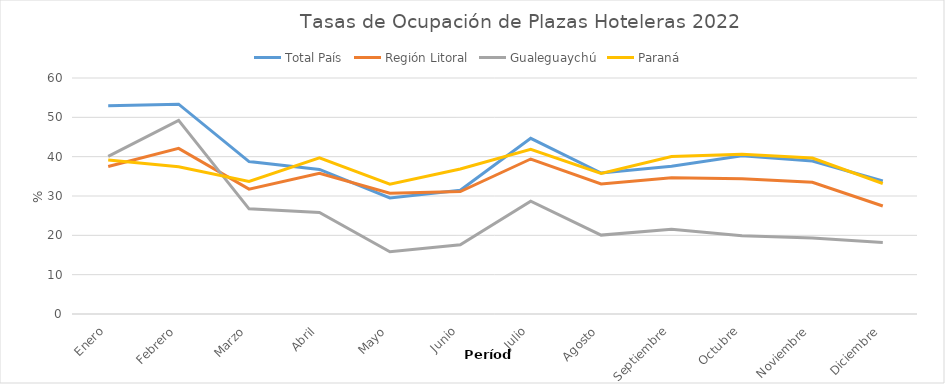
| Category | Total País | Región Litoral | Gualeguaychú | Paraná |
|---|---|---|---|---|
| Enero | 52.942 | 37.515 | 40.063 | 39.134 |
| Febrero | 53.354 | 42.106 | 49.246 | 37.415 |
| Marzo | 38.759 | 31.749 | 26.734 | 33.716 |
| Abril | 36.744 | 35.787 | 25.798 | 39.677 |
| Mayo | 29.516 | 30.714 | 15.826 | 33.026 |
| Junio | 31.471 | 31.123 | 17.619 | 36.857 |
| Julio | 44.663 | 39.405 | 28.682 | 41.867 |
| Agosto | 35.833 | 33.071 | 20.059 | 35.761 |
| Septiembre | 37.536 | 34.633 | 21.56 | 40.054 |
| Octubre | 40.201 | 34.39 | 19.881 | 40.636 |
| Noviembre | 38.88 | 33.47 | 19.3 | 39.649 |
| Diciembre | 33.799 | 27.464 | 18.19 | 33.175 |